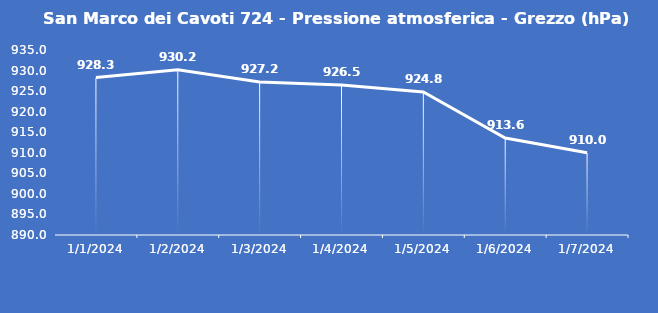
| Category | San Marco dei Cavoti 724 - Pressione atmosferica - Grezzo (hPa) |
|---|---|
| 1/1/24 | 928.3 |
| 1/2/24 | 930.2 |
| 1/3/24 | 927.2 |
| 1/4/24 | 926.5 |
| 1/5/24 | 924.8 |
| 1/6/24 | 913.6 |
| 1/7/24 | 910 |